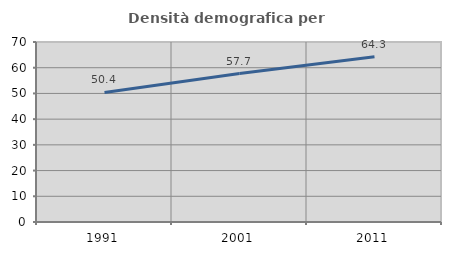
| Category | Densità demografica |
|---|---|
| 1991.0 | 50.366 |
| 2001.0 | 57.732 |
| 2011.0 | 64.302 |